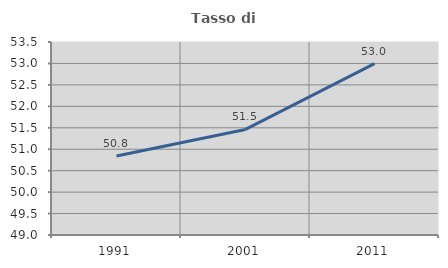
| Category | Tasso di occupazione   |
|---|---|
| 1991.0 | 50.841 |
| 2001.0 | 51.461 |
| 2011.0 | 52.996 |